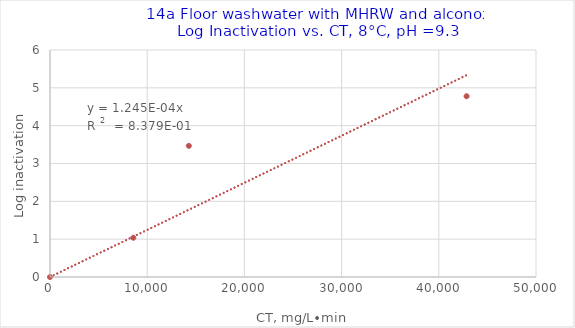
| Category | Series 1 |
|---|---|
| 0.0 | 0 |
| 8571.428571428572 | 1.038 |
| 14285.714285714286 | 3.466 |
| 42857.14285714286 | 4.778 |